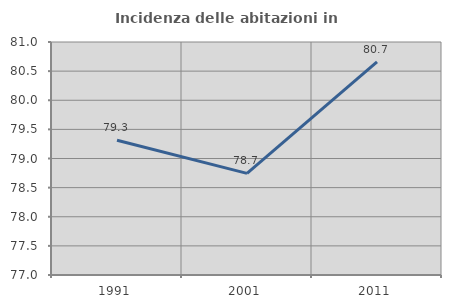
| Category | Incidenza delle abitazioni in proprietà  |
|---|---|
| 1991.0 | 79.313 |
| 2001.0 | 78.745 |
| 2011.0 | 80.657 |